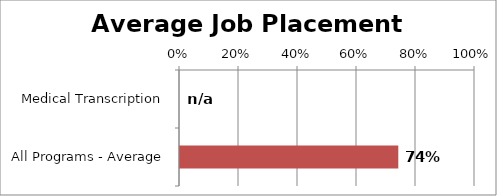
| Category | Series 0 |
|---|---|
| Medical Transcription | 0 |
| All Programs - Average | 0.74 |